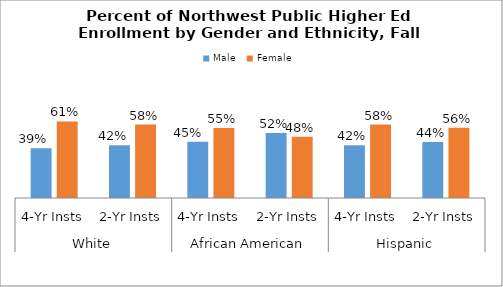
| Category | Male | Female |
|---|---|---|
| 0 | 0.393 | 0.607 |
| 1 | 0.418 | 0.582 |
| 2 | 0.446 | 0.554 |
| 3 | 0.515 | 0.485 |
| 4 | 0.418 | 0.582 |
| 5 | 0.444 | 0.556 |